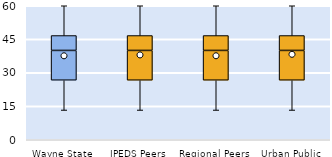
| Category | 25th | 50th | 75th |
|---|---|---|---|
| Wayne State | 26.667 | 13.333 | 6.667 |
| IPEDS Peers | 26.667 | 13.333 | 6.667 |
| Regional Peers | 26.667 | 13.333 | 6.667 |
| Urban Public | 26.667 | 13.333 | 6.667 |